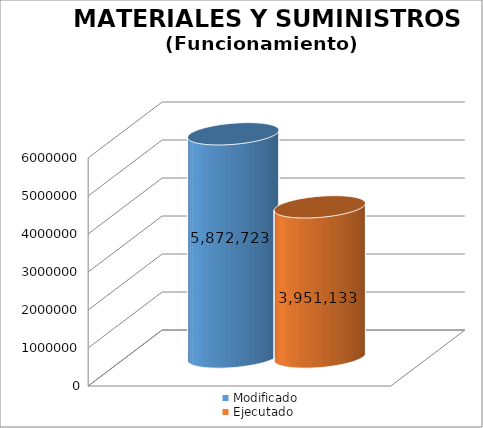
| Category | Modificado | Ejecutado |
|---|---|---|
| 0 | 5872723 | 3951133.16 |